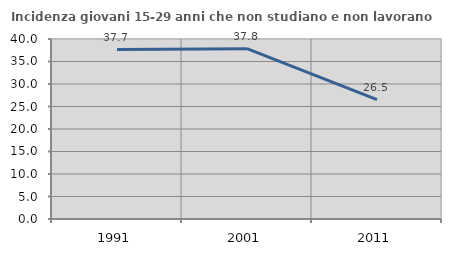
| Category | Incidenza giovani 15-29 anni che non studiano e non lavorano  |
|---|---|
| 1991.0 | 37.662 |
| 2001.0 | 37.847 |
| 2011.0 | 26.528 |